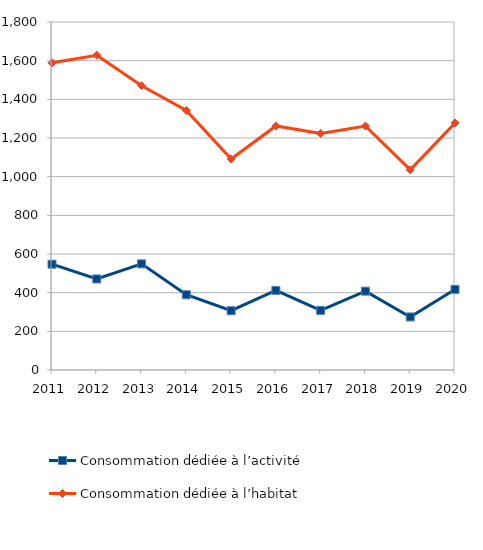
| Category | Consommation dédiée à l’activité | Consommation dédiée à l’habitat |
|---|---|---|
| 2011 | 547.286 | 1588.795 |
| 2012 | 470.891 | 1627.982 |
| 2013 | 548.913 | 1470.512 |
| 2014 | 389.235 | 1342.077 |
| 2015 | 306.543 | 1091.256 |
| 2016 | 411.7 | 1262.282 |
| 2017 | 308.412 | 1223.524 |
| 2018 | 407.739 | 1262.06 |
| 2019 | 274.412 | 1035.416 |
| 2020 | 417.04 | 1277.876 |